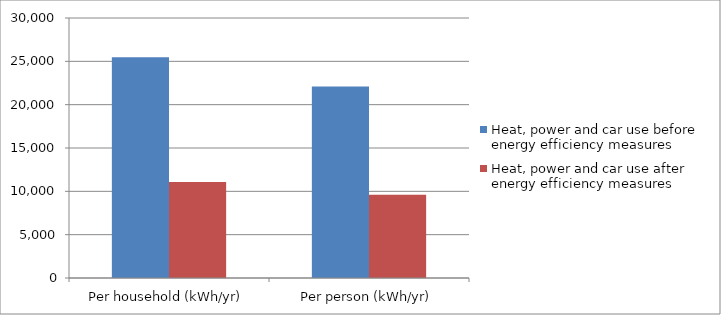
| Category | Heat, power and car use before energy efficiency measures | Heat, power and car use after energy efficiency measures |
|---|---|---|
| Per household (kWh/yr) | 25477.907 | 11077.351 |
| Per person (kWh/yr) | 22086.878 | 9602.99 |